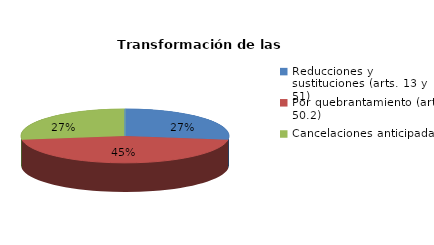
| Category | Series 0 |
|---|---|
| Reducciones y sustituciones (arts. 13 y 51) | 3 |
| Por quebrantamiento (art. 50.2) | 5 |
| Cancelaciones anticipadas | 3 |
| Traslado a Centros Penitenciarios | 0 |
| Conversión internamientos en cerrados (art. 51.2) | 0 |